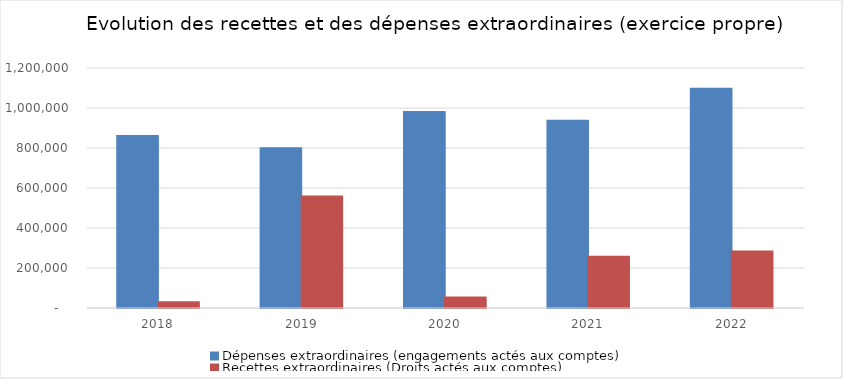
| Category | Dépenses extraordinaires (engagements actés aux comptes) | Recettes extraordinaires (Droits actés aux comptes) |
|---|---|---|
| 2018.0 | 857983.5 | 25792.86 |
| 2019.0 | 795719.09 | 554775.79 |
| 2020.0 | 977877.79 | 49473.27 |
| 2021.0 | 933136.75 | 254174.18 |
| 2022.0 | 1093966.08 | 280063.1 |